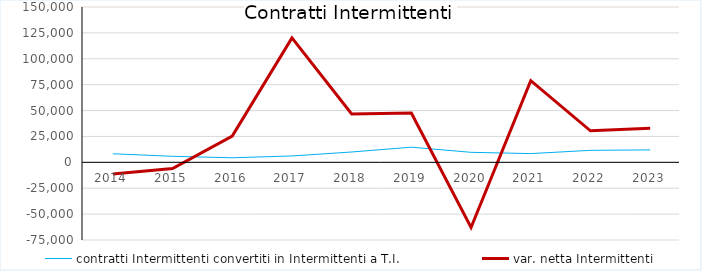
| Category | contratti Intermittenti convertiti in Intermittenti a T.I. | var. netta Intermittenti |
|---|---|---|
| 2014.0 | 8261 | -11300 |
| 2015.0 | 5828 | -5994 |
| 2016.0 | 4396 | 25287 |
| 2017.0 | 6154 | 120126 |
| 2018.0 | 9981 | 46730 |
| 2019.0 | 14618 | 47523 |
| 2020.0 | 9672 | -62905 |
| 2021.0 | 8432 | 78835 |
| 2022.0 | 11605 | 30440 |
| 2023.0 | 12015 | 32824 |